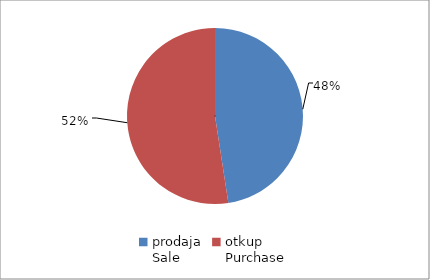
| Category | Series 0 |
|---|---|
| prodaja
Sale | 36287189.79 |
| otkup
Purchase | 39994959 |